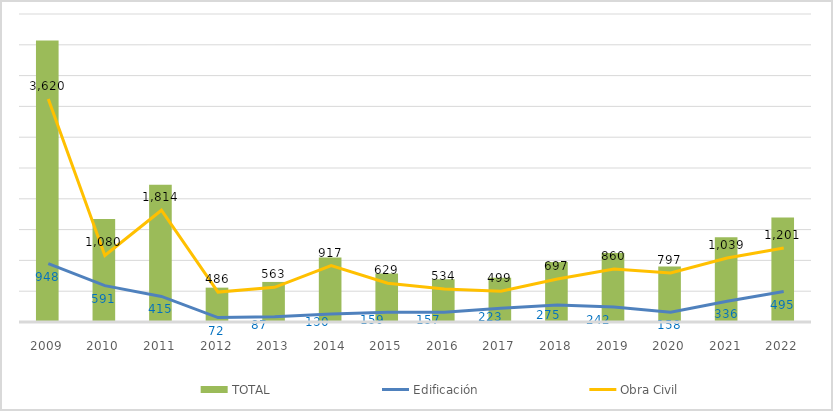
| Category | TOTAL |
|---|---|
| 2009.0 | 4567.868 |
| 2010.0 | 1671.018 |
| 2011.0 | 2229.383 |
| 2012.0 | 557.774 |
| 2013.0 | 650.312 |
| 2014.0 | 1046.781 |
| 2015.0 | 788.142 |
| 2016.0 | 692.431 |
| 2017.0 | 717.31 |
| 2018.0 | 973 |
| 2019.0 | 1119.269 |
| 2020.0 | 899 |
| 2021.0 | 1375.6 |
| 2022.0 | 1695.268 |